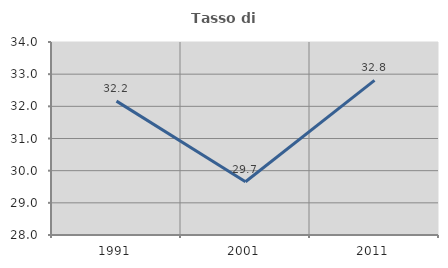
| Category | Tasso di occupazione   |
|---|---|
| 1991.0 | 32.162 |
| 2001.0 | 29.655 |
| 2011.0 | 32.806 |